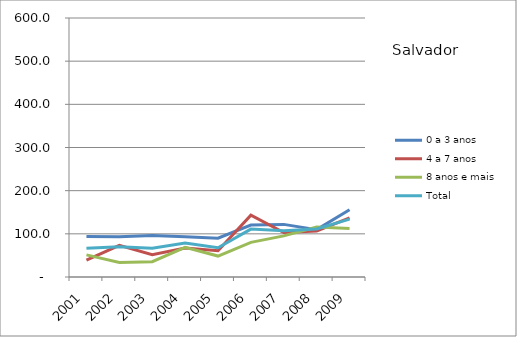
| Category | 0 a 3 anos | 4 a 7 anos | 8 anos e mais | Total |
|---|---|---|---|---|
| 2001.0 | 93.9 | 39 | 51.3 | 66.5 |
| 2002.0 | 93 | 73.3 | 33.4 | 69.8 |
| 2003.0 | 96.1 | 51.8 | 35.5 | 66.8 |
| 2004.0 | 93.5 | 67.1 | 68.9 | 78.9 |
| 2005.0 | 89.8 | 60.7 | 48.5 | 67.7 |
| 2006.0 | 120.4 | 143.2 | 80.2 | 111 |
| 2007.0 | 121.9 | 103 | 95.2 | 107.4 |
| 2008.0 | 109.7 | 106.8 | 115.8 | 111.3 |
| 2009.0 | 155.7 | 137.1 | 112.3 | 134 |